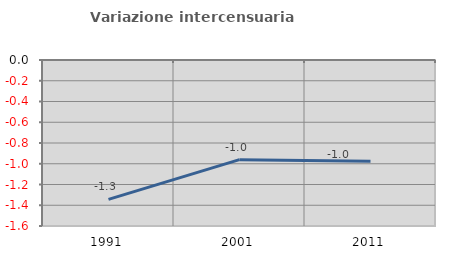
| Category | Variazione intercensuaria annua |
|---|---|
| 1991.0 | -1.343 |
| 2001.0 | -0.96 |
| 2011.0 | -0.977 |